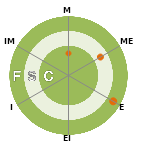
| Category | Series 0 | Series 1 | Series 2 |
|---|---|---|---|
| M | 10 | 10 | 1.5 |
| ME | 10 | 2.5 | 10 |
| E | 3.5 | 10 | 10 |
| EI | 10 | 10 | 10 |
| I | 10 | 10 | 10 |
| IM | 10 | 10 | 10 |